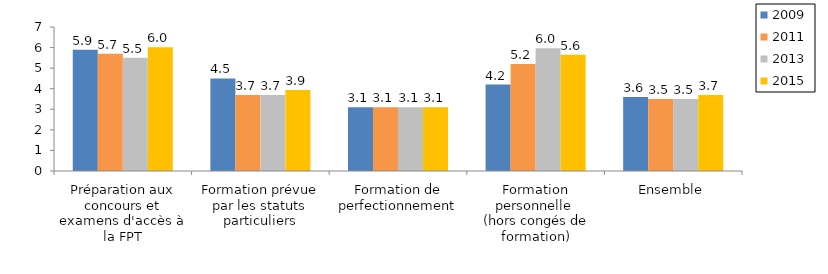
| Category | 2009 | 2011 | 2013 | 2015 |
|---|---|---|---|---|
| Préparation aux concours et examens d'accès à la FPT | 5.9 | 5.7 | 5.5 | 6.016 |
| Formation prévue par les statuts particuliers | 4.5 | 3.7 | 3.7 | 3.944 |
| Formation de perfectionnement | 3.1 | 3.1 | 3.1 | 3.102 |
| Formation personnelle 
(hors congés de formation) | 4.2 | 5.2 | 5.968 | 5.648 |
| Ensemble | 3.6 | 3.5 | 3.5 | 3.698 |